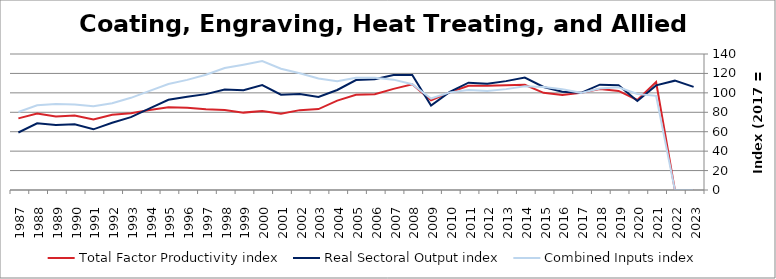
| Category | Total Factor Productivity index | Real Sectoral Output index | Combined Inputs index |
|---|---|---|---|
| 2023.0 | 0 | 106.117 | 0 |
| 2022.0 | 0 | 112.559 | 0 |
| 2021.0 | 111.165 | 107.716 | 96.897 |
| 2020.0 | 92.683 | 91.605 | 98.837 |
| 2019.0 | 102.024 | 107.953 | 105.811 |
| 2018.0 | 103.858 | 108.439 | 104.411 |
| 2017.0 | 100 | 100 | 100 |
| 2016.0 | 97.691 | 101.234 | 103.626 |
| 2015.0 | 100.044 | 106.093 | 106.046 |
| 2014.0 | 108.373 | 115.805 | 106.858 |
| 2013.0 | 107.927 | 112.077 | 103.846 |
| 2012.0 | 107.439 | 109.483 | 101.902 |
| 2011.0 | 107.324 | 110.473 | 102.935 |
| 2010.0 | 100.539 | 101.036 | 100.494 |
| 2009.0 | 92.283 | 86.902 | 94.169 |
| 2008.0 | 108.754 | 118.407 | 108.876 |
| 2007.0 | 104.099 | 118.258 | 113.602 |
| 2006.0 | 98.49 | 113.916 | 115.663 |
| 2005.0 | 97.938 | 113.21 | 115.594 |
| 2004.0 | 92.037 | 102.949 | 111.857 |
| 2003.0 | 83.31 | 95.688 | 114.857 |
| 2002.0 | 82.218 | 98.733 | 120.088 |
| 2001.0 | 78.622 | 98.166 | 124.858 |
| 2000.0 | 81.36 | 107.941 | 132.672 |
| 1999.0 | 79.656 | 102.708 | 128.94 |
| 1998.0 | 82.366 | 103.365 | 125.495 |
| 1997.0 | 83.221 | 98.693 | 118.591 |
| 1996.0 | 84.673 | 95.967 | 113.338 |
| 1995.0 | 85.106 | 92.818 | 109.062 |
| 1994.0 | 82.391 | 84.048 | 102.011 |
| 1993.0 | 79.065 | 75.02 | 94.884 |
| 1992.0 | 77.483 | 69.2 | 89.309 |
| 1991.0 | 72.533 | 62.461 | 86.114 |
| 1990.0 | 76.755 | 67.597 | 88.068 |
| 1989.0 | 75.621 | 66.882 | 88.444 |
| 1988.0 | 78.746 | 68.628 | 87.151 |
| 1987.0 | 73.742 | 59.184 | 80.258 |